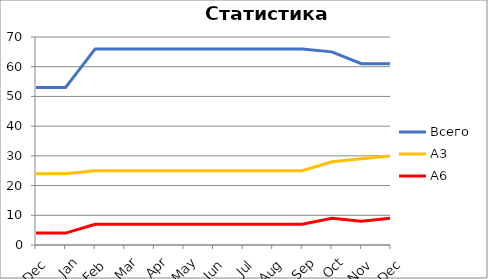
| Category | Всего | А3 | A6 |
|---|---|---|---|
| 0 | 53 | 24 | 4 |
| 1 | 53 | 24 | 4 |
| 2 | 66 | 25 | 7 |
| 3 | 66 | 25 | 7 |
| 4 | 66 | 25 | 7 |
| 5 | 66 | 25 | 7 |
| 6 | 66 | 25 | 7 |
| 7 | 66 | 25 | 7 |
| 8 | 66 | 25 | 7 |
| 9 | 66 | 25 | 7 |
| 10 | 65 | 28 | 9 |
| 11 | 61 | 29 | 8 |
| 12 | 61 | 30 | 9 |